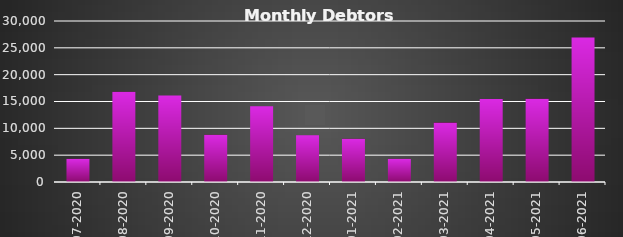
| Category |  Debtors  |
|---|---|
| 2020-07-31 | 4320 |
| 2020-08-31 | 16800 |
| 2020-09-30 | 16140 |
| 2020-10-31 | 8820 |
| 2020-11-30 | 14095 |
| 2020-12-31 | 8712 |
| 2021-01-31 | 8044 |
| 2021-02-28 | 4320 |
| 2021-03-31 | 11070 |
| 2021-04-30 | 15476 |
| 2021-05-31 | 15516 |
| 2021-06-30 | 26946 |